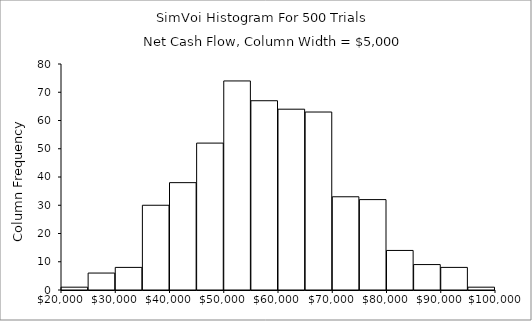
| Category | Series 0 |
|---|---|
| 25000.0 | 1 |
| 30000.0 | 6 |
| 35000.0 | 8 |
| 40000.0 | 30 |
| 45000.0 | 38 |
| 50000.0 | 52 |
| 55000.0 | 74 |
| 60000.0 | 67 |
| 65000.0 | 64 |
| 70000.0 | 63 |
| 75000.0 | 33 |
| 80000.0 | 32 |
| 85000.0 | 14 |
| 90000.0 | 9 |
| 95000.0 | 8 |
| 100000.0 | 1 |